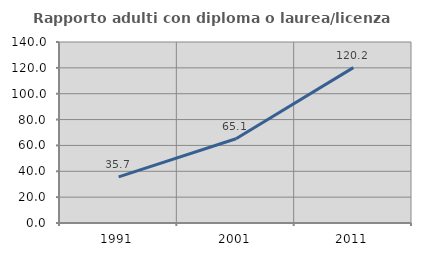
| Category | Rapporto adulti con diploma o laurea/licenza media  |
|---|---|
| 1991.0 | 35.669 |
| 2001.0 | 65.138 |
| 2011.0 | 120.175 |